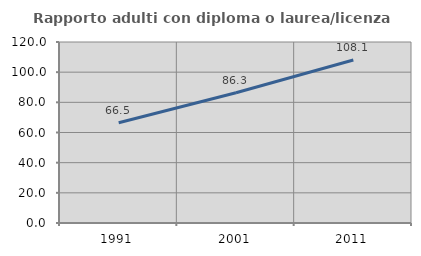
| Category | Rapporto adulti con diploma o laurea/licenza media  |
|---|---|
| 1991.0 | 66.477 |
| 2001.0 | 86.319 |
| 2011.0 | 108.059 |